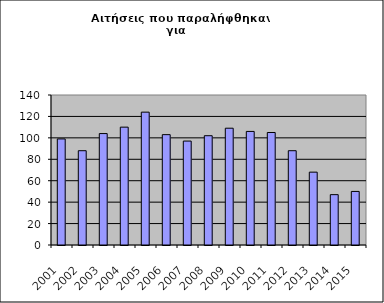
| Category | Series 1 |
|---|---|
| 2001.0 | 99 |
| 2002.0 | 88 |
| 2003.0 | 104 |
| 2004.0 | 110 |
| 2005.0 | 124 |
| 2006.0 | 103 |
| 2007.0 | 97 |
| 2008.0 | 102 |
| 2009.0 | 109 |
| 2010.0 | 106 |
| 2011.0 | 105 |
| 2012.0 | 88 |
| 2013.0 | 68 |
| 2014.0 | 47 |
| 2015.0 | 50 |